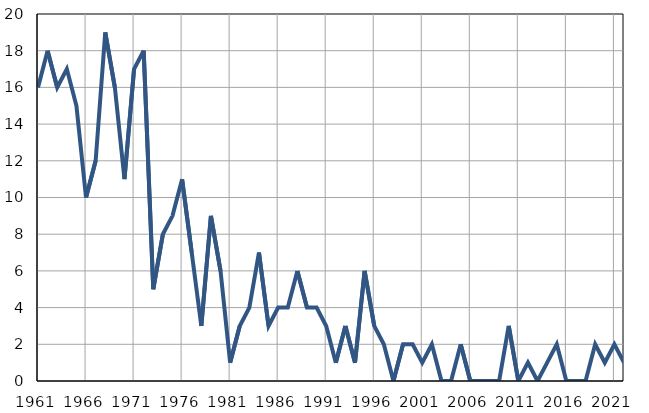
| Category | Infants
deaths |
|---|---|
| 1961.0 | 16 |
| 1962.0 | 18 |
| 1963.0 | 16 |
| 1964.0 | 17 |
| 1965.0 | 15 |
| 1966.0 | 10 |
| 1967.0 | 12 |
| 1968.0 | 19 |
| 1969.0 | 16 |
| 1970.0 | 11 |
| 1971.0 | 17 |
| 1972.0 | 18 |
| 1973.0 | 5 |
| 1974.0 | 8 |
| 1975.0 | 9 |
| 1976.0 | 11 |
| 1977.0 | 7 |
| 1978.0 | 3 |
| 1979.0 | 9 |
| 1980.0 | 6 |
| 1981.0 | 1 |
| 1982.0 | 3 |
| 1983.0 | 4 |
| 1984.0 | 7 |
| 1985.0 | 3 |
| 1986.0 | 4 |
| 1987.0 | 4 |
| 1988.0 | 6 |
| 1989.0 | 4 |
| 1990.0 | 4 |
| 1991.0 | 3 |
| 1992.0 | 1 |
| 1993.0 | 3 |
| 1994.0 | 1 |
| 1995.0 | 6 |
| 1996.0 | 3 |
| 1997.0 | 2 |
| 1998.0 | 0 |
| 1999.0 | 2 |
| 2000.0 | 2 |
| 2001.0 | 1 |
| 2002.0 | 2 |
| 2003.0 | 0 |
| 2004.0 | 0 |
| 2005.0 | 2 |
| 2006.0 | 0 |
| 2007.0 | 0 |
| 2008.0 | 0 |
| 2009.0 | 0 |
| 2010.0 | 3 |
| 2011.0 | 0 |
| 2012.0 | 1 |
| 2013.0 | 0 |
| 2014.0 | 1 |
| 2015.0 | 2 |
| 2016.0 | 0 |
| 2017.0 | 0 |
| 2018.0 | 0 |
| 2019.0 | 2 |
| 2020.0 | 1 |
| 2021.0 | 2 |
| 2022.0 | 1 |